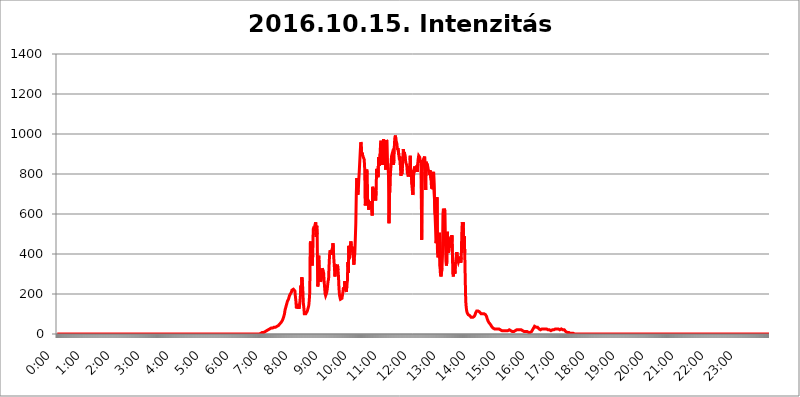
| Category | 2016.10.15. Intenzitás [W/m^2] |
|---|---|
| 0.0 | 0 |
| 0.0006944444444444445 | 0 |
| 0.001388888888888889 | 0 |
| 0.0020833333333333333 | 0 |
| 0.002777777777777778 | 0 |
| 0.003472222222222222 | 0 |
| 0.004166666666666667 | 0 |
| 0.004861111111111111 | 0 |
| 0.005555555555555556 | 0 |
| 0.0062499999999999995 | 0 |
| 0.006944444444444444 | 0 |
| 0.007638888888888889 | 0 |
| 0.008333333333333333 | 0 |
| 0.009027777777777779 | 0 |
| 0.009722222222222222 | 0 |
| 0.010416666666666666 | 0 |
| 0.011111111111111112 | 0 |
| 0.011805555555555555 | 0 |
| 0.012499999999999999 | 0 |
| 0.013194444444444444 | 0 |
| 0.013888888888888888 | 0 |
| 0.014583333333333332 | 0 |
| 0.015277777777777777 | 0 |
| 0.015972222222222224 | 0 |
| 0.016666666666666666 | 0 |
| 0.017361111111111112 | 0 |
| 0.018055555555555557 | 0 |
| 0.01875 | 0 |
| 0.019444444444444445 | 0 |
| 0.02013888888888889 | 0 |
| 0.020833333333333332 | 0 |
| 0.02152777777777778 | 0 |
| 0.022222222222222223 | 0 |
| 0.02291666666666667 | 0 |
| 0.02361111111111111 | 0 |
| 0.024305555555555556 | 0 |
| 0.024999999999999998 | 0 |
| 0.025694444444444447 | 0 |
| 0.02638888888888889 | 0 |
| 0.027083333333333334 | 0 |
| 0.027777777777777776 | 0 |
| 0.02847222222222222 | 0 |
| 0.029166666666666664 | 0 |
| 0.029861111111111113 | 0 |
| 0.030555555555555555 | 0 |
| 0.03125 | 0 |
| 0.03194444444444445 | 0 |
| 0.03263888888888889 | 0 |
| 0.03333333333333333 | 0 |
| 0.034027777777777775 | 0 |
| 0.034722222222222224 | 0 |
| 0.035416666666666666 | 0 |
| 0.036111111111111115 | 0 |
| 0.03680555555555556 | 0 |
| 0.0375 | 0 |
| 0.03819444444444444 | 0 |
| 0.03888888888888889 | 0 |
| 0.03958333333333333 | 0 |
| 0.04027777777777778 | 0 |
| 0.04097222222222222 | 0 |
| 0.041666666666666664 | 0 |
| 0.042361111111111106 | 0 |
| 0.04305555555555556 | 0 |
| 0.043750000000000004 | 0 |
| 0.044444444444444446 | 0 |
| 0.04513888888888889 | 0 |
| 0.04583333333333334 | 0 |
| 0.04652777777777778 | 0 |
| 0.04722222222222222 | 0 |
| 0.04791666666666666 | 0 |
| 0.04861111111111111 | 0 |
| 0.049305555555555554 | 0 |
| 0.049999999999999996 | 0 |
| 0.05069444444444445 | 0 |
| 0.051388888888888894 | 0 |
| 0.052083333333333336 | 0 |
| 0.05277777777777778 | 0 |
| 0.05347222222222222 | 0 |
| 0.05416666666666667 | 0 |
| 0.05486111111111111 | 0 |
| 0.05555555555555555 | 0 |
| 0.05625 | 0 |
| 0.05694444444444444 | 0 |
| 0.057638888888888885 | 0 |
| 0.05833333333333333 | 0 |
| 0.05902777777777778 | 0 |
| 0.059722222222222225 | 0 |
| 0.06041666666666667 | 0 |
| 0.061111111111111116 | 0 |
| 0.06180555555555556 | 0 |
| 0.0625 | 0 |
| 0.06319444444444444 | 0 |
| 0.06388888888888888 | 0 |
| 0.06458333333333334 | 0 |
| 0.06527777777777778 | 0 |
| 0.06597222222222222 | 0 |
| 0.06666666666666667 | 0 |
| 0.06736111111111111 | 0 |
| 0.06805555555555555 | 0 |
| 0.06874999999999999 | 0 |
| 0.06944444444444443 | 0 |
| 0.07013888888888889 | 0 |
| 0.07083333333333333 | 0 |
| 0.07152777777777779 | 0 |
| 0.07222222222222223 | 0 |
| 0.07291666666666667 | 0 |
| 0.07361111111111111 | 0 |
| 0.07430555555555556 | 0 |
| 0.075 | 0 |
| 0.07569444444444444 | 0 |
| 0.0763888888888889 | 0 |
| 0.07708333333333334 | 0 |
| 0.07777777777777778 | 0 |
| 0.07847222222222222 | 0 |
| 0.07916666666666666 | 0 |
| 0.0798611111111111 | 0 |
| 0.08055555555555556 | 0 |
| 0.08125 | 0 |
| 0.08194444444444444 | 0 |
| 0.08263888888888889 | 0 |
| 0.08333333333333333 | 0 |
| 0.08402777777777777 | 0 |
| 0.08472222222222221 | 0 |
| 0.08541666666666665 | 0 |
| 0.08611111111111112 | 0 |
| 0.08680555555555557 | 0 |
| 0.08750000000000001 | 0 |
| 0.08819444444444445 | 0 |
| 0.08888888888888889 | 0 |
| 0.08958333333333333 | 0 |
| 0.09027777777777778 | 0 |
| 0.09097222222222222 | 0 |
| 0.09166666666666667 | 0 |
| 0.09236111111111112 | 0 |
| 0.09305555555555556 | 0 |
| 0.09375 | 0 |
| 0.09444444444444444 | 0 |
| 0.09513888888888888 | 0 |
| 0.09583333333333333 | 0 |
| 0.09652777777777777 | 0 |
| 0.09722222222222222 | 0 |
| 0.09791666666666667 | 0 |
| 0.09861111111111111 | 0 |
| 0.09930555555555555 | 0 |
| 0.09999999999999999 | 0 |
| 0.10069444444444443 | 0 |
| 0.1013888888888889 | 0 |
| 0.10208333333333335 | 0 |
| 0.10277777777777779 | 0 |
| 0.10347222222222223 | 0 |
| 0.10416666666666667 | 0 |
| 0.10486111111111111 | 0 |
| 0.10555555555555556 | 0 |
| 0.10625 | 0 |
| 0.10694444444444444 | 0 |
| 0.1076388888888889 | 0 |
| 0.10833333333333334 | 0 |
| 0.10902777777777778 | 0 |
| 0.10972222222222222 | 0 |
| 0.1111111111111111 | 0 |
| 0.11180555555555556 | 0 |
| 0.11180555555555556 | 0 |
| 0.1125 | 0 |
| 0.11319444444444444 | 0 |
| 0.11388888888888889 | 0 |
| 0.11458333333333333 | 0 |
| 0.11527777777777777 | 0 |
| 0.11597222222222221 | 0 |
| 0.11666666666666665 | 0 |
| 0.1173611111111111 | 0 |
| 0.11805555555555557 | 0 |
| 0.11944444444444445 | 0 |
| 0.12013888888888889 | 0 |
| 0.12083333333333333 | 0 |
| 0.12152777777777778 | 0 |
| 0.12222222222222223 | 0 |
| 0.12291666666666667 | 0 |
| 0.12291666666666667 | 0 |
| 0.12361111111111112 | 0 |
| 0.12430555555555556 | 0 |
| 0.125 | 0 |
| 0.12569444444444444 | 0 |
| 0.12638888888888888 | 0 |
| 0.12708333333333333 | 0 |
| 0.16875 | 0 |
| 0.12847222222222224 | 0 |
| 0.12916666666666668 | 0 |
| 0.12986111111111112 | 0 |
| 0.13055555555555556 | 0 |
| 0.13125 | 0 |
| 0.13194444444444445 | 0 |
| 0.1326388888888889 | 0 |
| 0.13333333333333333 | 0 |
| 0.13402777777777777 | 0 |
| 0.13402777777777777 | 0 |
| 0.13472222222222222 | 0 |
| 0.13541666666666666 | 0 |
| 0.1361111111111111 | 0 |
| 0.13749999999999998 | 0 |
| 0.13819444444444443 | 0 |
| 0.1388888888888889 | 0 |
| 0.13958333333333334 | 0 |
| 0.14027777777777778 | 0 |
| 0.14097222222222222 | 0 |
| 0.14166666666666666 | 0 |
| 0.1423611111111111 | 0 |
| 0.14305555555555557 | 0 |
| 0.14375000000000002 | 0 |
| 0.14444444444444446 | 0 |
| 0.1451388888888889 | 0 |
| 0.1451388888888889 | 0 |
| 0.14652777777777778 | 0 |
| 0.14722222222222223 | 0 |
| 0.14791666666666667 | 0 |
| 0.1486111111111111 | 0 |
| 0.14930555555555555 | 0 |
| 0.15 | 0 |
| 0.15069444444444444 | 0 |
| 0.15138888888888888 | 0 |
| 0.15208333333333332 | 0 |
| 0.15277777777777776 | 0 |
| 0.15347222222222223 | 0 |
| 0.15416666666666667 | 0 |
| 0.15486111111111112 | 0 |
| 0.15555555555555556 | 0 |
| 0.15625 | 0 |
| 0.15694444444444444 | 0 |
| 0.15763888888888888 | 0 |
| 0.15833333333333333 | 0 |
| 0.15902777777777777 | 0 |
| 0.15972222222222224 | 0 |
| 0.16041666666666668 | 0 |
| 0.16111111111111112 | 0 |
| 0.16180555555555556 | 0 |
| 0.1625 | 0 |
| 0.16319444444444445 | 0 |
| 0.1638888888888889 | 0 |
| 0.16458333333333333 | 0 |
| 0.16527777777777777 | 0 |
| 0.16597222222222222 | 0 |
| 0.16666666666666666 | 0 |
| 0.1673611111111111 | 0 |
| 0.16805555555555554 | 0 |
| 0.16874999999999998 | 0 |
| 0.16944444444444443 | 0 |
| 0.17013888888888887 | 0 |
| 0.1708333333333333 | 0 |
| 0.17152777777777775 | 0 |
| 0.17222222222222225 | 0 |
| 0.1729166666666667 | 0 |
| 0.17361111111111113 | 0 |
| 0.17430555555555557 | 0 |
| 0.17500000000000002 | 0 |
| 0.17569444444444446 | 0 |
| 0.1763888888888889 | 0 |
| 0.17708333333333334 | 0 |
| 0.17777777777777778 | 0 |
| 0.17847222222222223 | 0 |
| 0.17916666666666667 | 0 |
| 0.1798611111111111 | 0 |
| 0.18055555555555555 | 0 |
| 0.18125 | 0 |
| 0.18194444444444444 | 0 |
| 0.1826388888888889 | 0 |
| 0.18333333333333335 | 0 |
| 0.1840277777777778 | 0 |
| 0.18472222222222223 | 0 |
| 0.18541666666666667 | 0 |
| 0.18611111111111112 | 0 |
| 0.18680555555555556 | 0 |
| 0.1875 | 0 |
| 0.18819444444444444 | 0 |
| 0.18888888888888888 | 0 |
| 0.18958333333333333 | 0 |
| 0.19027777777777777 | 0 |
| 0.1909722222222222 | 0 |
| 0.19166666666666665 | 0 |
| 0.19236111111111112 | 0 |
| 0.19305555555555554 | 0 |
| 0.19375 | 0 |
| 0.19444444444444445 | 0 |
| 0.1951388888888889 | 0 |
| 0.19583333333333333 | 0 |
| 0.19652777777777777 | 0 |
| 0.19722222222222222 | 0 |
| 0.19791666666666666 | 0 |
| 0.1986111111111111 | 0 |
| 0.19930555555555554 | 0 |
| 0.19999999999999998 | 0 |
| 0.20069444444444443 | 0 |
| 0.20138888888888887 | 0 |
| 0.2020833333333333 | 0 |
| 0.2027777777777778 | 0 |
| 0.2034722222222222 | 0 |
| 0.2041666666666667 | 0 |
| 0.20486111111111113 | 0 |
| 0.20555555555555557 | 0 |
| 0.20625000000000002 | 0 |
| 0.20694444444444446 | 0 |
| 0.2076388888888889 | 0 |
| 0.20833333333333334 | 0 |
| 0.20902777777777778 | 0 |
| 0.20972222222222223 | 0 |
| 0.21041666666666667 | 0 |
| 0.2111111111111111 | 0 |
| 0.21180555555555555 | 0 |
| 0.2125 | 0 |
| 0.21319444444444444 | 0 |
| 0.2138888888888889 | 0 |
| 0.21458333333333335 | 0 |
| 0.2152777777777778 | 0 |
| 0.21597222222222223 | 0 |
| 0.21666666666666667 | 0 |
| 0.21736111111111112 | 0 |
| 0.21805555555555556 | 0 |
| 0.21875 | 0 |
| 0.21944444444444444 | 0 |
| 0.22013888888888888 | 0 |
| 0.22083333333333333 | 0 |
| 0.22152777777777777 | 0 |
| 0.2222222222222222 | 0 |
| 0.22291666666666665 | 0 |
| 0.2236111111111111 | 0 |
| 0.22430555555555556 | 0 |
| 0.225 | 0 |
| 0.22569444444444445 | 0 |
| 0.2263888888888889 | 0 |
| 0.22708333333333333 | 0 |
| 0.22777777777777777 | 0 |
| 0.22847222222222222 | 0 |
| 0.22916666666666666 | 0 |
| 0.2298611111111111 | 0 |
| 0.23055555555555554 | 0 |
| 0.23124999999999998 | 0 |
| 0.23194444444444443 | 0 |
| 0.23263888888888887 | 0 |
| 0.2333333333333333 | 0 |
| 0.2340277777777778 | 0 |
| 0.2347222222222222 | 0 |
| 0.2354166666666667 | 0 |
| 0.23611111111111113 | 0 |
| 0.23680555555555557 | 0 |
| 0.23750000000000002 | 0 |
| 0.23819444444444446 | 0 |
| 0.2388888888888889 | 0 |
| 0.23958333333333334 | 0 |
| 0.24027777777777778 | 0 |
| 0.24097222222222223 | 0 |
| 0.24166666666666667 | 0 |
| 0.2423611111111111 | 0 |
| 0.24305555555555555 | 0 |
| 0.24375 | 0 |
| 0.24444444444444446 | 0 |
| 0.24513888888888888 | 0 |
| 0.24583333333333335 | 0 |
| 0.2465277777777778 | 0 |
| 0.24722222222222223 | 0 |
| 0.24791666666666667 | 0 |
| 0.24861111111111112 | 0 |
| 0.24930555555555556 | 0 |
| 0.25 | 0 |
| 0.25069444444444444 | 0 |
| 0.2513888888888889 | 0 |
| 0.2520833333333333 | 0 |
| 0.25277777777777777 | 0 |
| 0.2534722222222222 | 0 |
| 0.25416666666666665 | 0 |
| 0.2548611111111111 | 0 |
| 0.2555555555555556 | 0 |
| 0.25625000000000003 | 0 |
| 0.2569444444444445 | 0 |
| 0.2576388888888889 | 0 |
| 0.25833333333333336 | 0 |
| 0.2590277777777778 | 0 |
| 0.25972222222222224 | 0 |
| 0.2604166666666667 | 0 |
| 0.2611111111111111 | 0 |
| 0.26180555555555557 | 0 |
| 0.2625 | 0 |
| 0.26319444444444445 | 0 |
| 0.2638888888888889 | 0 |
| 0.26458333333333334 | 0 |
| 0.2652777777777778 | 0 |
| 0.2659722222222222 | 0 |
| 0.26666666666666666 | 0 |
| 0.2673611111111111 | 0 |
| 0.26805555555555555 | 0 |
| 0.26875 | 0 |
| 0.26944444444444443 | 0 |
| 0.2701388888888889 | 0 |
| 0.2708333333333333 | 0 |
| 0.27152777777777776 | 0 |
| 0.2722222222222222 | 0 |
| 0.27291666666666664 | 0 |
| 0.2736111111111111 | 0 |
| 0.2743055555555555 | 0 |
| 0.27499999999999997 | 0 |
| 0.27569444444444446 | 0 |
| 0.27638888888888885 | 0 |
| 0.27708333333333335 | 0 |
| 0.2777777777777778 | 0 |
| 0.27847222222222223 | 0 |
| 0.2791666666666667 | 0 |
| 0.2798611111111111 | 0 |
| 0.28055555555555556 | 0 |
| 0.28125 | 0 |
| 0.28194444444444444 | 0 |
| 0.2826388888888889 | 0 |
| 0.2833333333333333 | 0 |
| 0.28402777777777777 | 3.525 |
| 0.2847222222222222 | 3.525 |
| 0.28541666666666665 | 3.525 |
| 0.28611111111111115 | 3.525 |
| 0.28680555555555554 | 7.887 |
| 0.28750000000000003 | 7.887 |
| 0.2881944444444445 | 7.887 |
| 0.2888888888888889 | 7.887 |
| 0.28958333333333336 | 7.887 |
| 0.2902777777777778 | 7.887 |
| 0.29097222222222224 | 12.257 |
| 0.2916666666666667 | 12.257 |
| 0.2923611111111111 | 12.257 |
| 0.29305555555555557 | 12.257 |
| 0.29375 | 16.636 |
| 0.29444444444444445 | 16.636 |
| 0.2951388888888889 | 16.636 |
| 0.29583333333333334 | 21.024 |
| 0.2965277777777778 | 21.024 |
| 0.2972222222222222 | 21.024 |
| 0.29791666666666666 | 25.419 |
| 0.2986111111111111 | 25.419 |
| 0.29930555555555555 | 25.419 |
| 0.3 | 29.823 |
| 0.30069444444444443 | 29.823 |
| 0.3013888888888889 | 29.823 |
| 0.3020833333333333 | 29.823 |
| 0.30277777777777776 | 29.823 |
| 0.3034722222222222 | 29.823 |
| 0.30416666666666664 | 34.234 |
| 0.3048611111111111 | 34.234 |
| 0.3055555555555555 | 34.234 |
| 0.30624999999999997 | 34.234 |
| 0.3069444444444444 | 34.234 |
| 0.3076388888888889 | 38.653 |
| 0.30833333333333335 | 38.653 |
| 0.3090277777777778 | 38.653 |
| 0.30972222222222223 | 43.079 |
| 0.3104166666666667 | 43.079 |
| 0.3111111111111111 | 47.511 |
| 0.31180555555555556 | 47.511 |
| 0.3125 | 51.951 |
| 0.31319444444444444 | 51.951 |
| 0.3138888888888889 | 56.398 |
| 0.3145833333333333 | 60.85 |
| 0.31527777777777777 | 65.31 |
| 0.3159722222222222 | 69.775 |
| 0.31666666666666665 | 74.246 |
| 0.31736111111111115 | 83.205 |
| 0.31805555555555554 | 92.184 |
| 0.31875000000000003 | 101.184 |
| 0.3194444444444445 | 119.235 |
| 0.3201388888888889 | 128.284 |
| 0.32083333333333336 | 137.347 |
| 0.3215277777777778 | 146.423 |
| 0.32222222222222224 | 155.509 |
| 0.3229166666666667 | 164.605 |
| 0.3236111111111111 | 169.156 |
| 0.32430555555555557 | 173.709 |
| 0.325 | 182.82 |
| 0.32569444444444445 | 191.937 |
| 0.3263888888888889 | 196.497 |
| 0.32708333333333334 | 201.058 |
| 0.3277777777777778 | 205.62 |
| 0.3284722222222222 | 210.182 |
| 0.32916666666666666 | 219.309 |
| 0.3298611111111111 | 223.873 |
| 0.33055555555555555 | 223.873 |
| 0.33125 | 223.873 |
| 0.33194444444444443 | 223.873 |
| 0.3326388888888889 | 219.309 |
| 0.3333333333333333 | 214.746 |
| 0.3340277777777778 | 187.378 |
| 0.3347222222222222 | 164.605 |
| 0.3354166666666667 | 128.284 |
| 0.3361111111111111 | 137.347 |
| 0.3368055555555556 | 150.964 |
| 0.33749999999999997 | 132.814 |
| 0.33819444444444446 | 132.814 |
| 0.33888888888888885 | 137.347 |
| 0.33958333333333335 | 132.814 |
| 0.34027777777777773 | 128.284 |
| 0.34097222222222223 | 187.378 |
| 0.3416666666666666 | 242.127 |
| 0.3423611111111111 | 205.62 |
| 0.3430555555555555 | 283.156 |
| 0.34375 | 260.373 |
| 0.3444444444444445 | 219.309 |
| 0.3451388888888889 | 155.509 |
| 0.3458333333333334 | 132.814 |
| 0.34652777777777777 | 101.184 |
| 0.34722222222222227 | 101.184 |
| 0.34791666666666665 | 101.184 |
| 0.34861111111111115 | 101.184 |
| 0.34930555555555554 | 101.184 |
| 0.35000000000000003 | 105.69 |
| 0.3506944444444444 | 114.716 |
| 0.3513888888888889 | 123.758 |
| 0.3520833333333333 | 128.284 |
| 0.3527777777777778 | 141.884 |
| 0.3534722222222222 | 169.156 |
| 0.3541666666666667 | 210.182 |
| 0.3548611111111111 | 453.968 |
| 0.35555555555555557 | 462.786 |
| 0.35625 | 391.685 |
| 0.35694444444444445 | 360.221 |
| 0.3576388888888889 | 342.162 |
| 0.35833333333333334 | 396.164 |
| 0.3590277777777778 | 523.88 |
| 0.3597222222222222 | 523.88 |
| 0.36041666666666666 | 536.82 |
| 0.3611111111111111 | 515.223 |
| 0.36180555555555555 | 549.704 |
| 0.3625 | 558.261 |
| 0.36319444444444443 | 484.735 |
| 0.3638888888888889 | 541.121 |
| 0.3645833333333333 | 497.836 |
| 0.3652777777777778 | 237.564 |
| 0.3659722222222222 | 251.251 |
| 0.3666666666666667 | 391.685 |
| 0.3673611111111111 | 337.639 |
| 0.3680555555555556 | 324.052 |
| 0.36874999999999997 | 292.259 |
| 0.36944444444444446 | 260.373 |
| 0.37013888888888885 | 260.373 |
| 0.37083333333333335 | 287.709 |
| 0.37152777777777773 | 328.584 |
| 0.37222222222222223 | 333.113 |
| 0.3729166666666666 | 314.98 |
| 0.3736111111111111 | 305.898 |
| 0.3743055555555555 | 264.932 |
| 0.375 | 233 |
| 0.3756944444444445 | 201.058 |
| 0.3763888888888889 | 191.937 |
| 0.3770833333333334 | 196.497 |
| 0.37777777777777777 | 205.62 |
| 0.37847222222222227 | 219.309 |
| 0.37916666666666665 | 219.309 |
| 0.37986111111111115 | 264.932 |
| 0.38055555555555554 | 274.047 |
| 0.38125000000000003 | 342.162 |
| 0.3819444444444444 | 396.164 |
| 0.3826388888888889 | 418.492 |
| 0.3833333333333333 | 409.574 |
| 0.3840277777777778 | 396.164 |
| 0.3847222222222222 | 414.035 |
| 0.3854166666666667 | 422.943 |
| 0.3861111111111111 | 431.833 |
| 0.38680555555555557 | 453.968 |
| 0.3875 | 400.638 |
| 0.38819444444444445 | 396.164 |
| 0.3888888888888889 | 324.052 |
| 0.38958333333333334 | 287.709 |
| 0.3902777777777778 | 346.682 |
| 0.3909722222222222 | 346.682 |
| 0.39166666666666666 | 333.113 |
| 0.3923611111111111 | 328.584 |
| 0.39305555555555555 | 346.682 |
| 0.39375 | 319.517 |
| 0.39444444444444443 | 287.709 |
| 0.3951388888888889 | 228.436 |
| 0.3958333333333333 | 196.497 |
| 0.3965277777777778 | 182.82 |
| 0.3972222222222222 | 173.709 |
| 0.3979166666666667 | 173.709 |
| 0.3986111111111111 | 173.709 |
| 0.3993055555555556 | 178.264 |
| 0.39999999999999997 | 182.82 |
| 0.40069444444444446 | 210.182 |
| 0.40138888888888885 | 233 |
| 0.40208333333333335 | 233 |
| 0.40277777777777773 | 219.309 |
| 0.40347222222222223 | 264.932 |
| 0.4041666666666666 | 223.873 |
| 0.4048611111111111 | 219.309 |
| 0.4055555555555555 | 210.182 |
| 0.40625 | 251.251 |
| 0.4069444444444445 | 264.932 |
| 0.4076388888888889 | 360.221 |
| 0.4083333333333334 | 305.898 |
| 0.40902777777777777 | 440.702 |
| 0.40972222222222227 | 378.224 |
| 0.41041666666666665 | 414.035 |
| 0.41111111111111115 | 409.574 |
| 0.41180555555555554 | 462.786 |
| 0.41250000000000003 | 440.702 |
| 0.4131944444444444 | 409.574 |
| 0.4138888888888889 | 436.27 |
| 0.4145833333333333 | 440.702 |
| 0.4152777777777778 | 382.715 |
| 0.4159722222222222 | 346.682 |
| 0.4166666666666667 | 378.224 |
| 0.4173611111111111 | 405.108 |
| 0.41805555555555557 | 475.972 |
| 0.41875 | 553.986 |
| 0.41944444444444445 | 703.762 |
| 0.4201388888888889 | 779.42 |
| 0.42083333333333334 | 723.889 |
| 0.4215277777777778 | 695.666 |
| 0.4222222222222222 | 719.877 |
| 0.42291666666666666 | 771.559 |
| 0.4236111111111111 | 814.519 |
| 0.42430555555555555 | 818.392 |
| 0.425 | 913.766 |
| 0.42569444444444443 | 958.814 |
| 0.4263888888888889 | 951.327 |
| 0.4270833333333333 | 891.099 |
| 0.4277777777777778 | 906.223 |
| 0.4284722222222222 | 891.099 |
| 0.4291666666666667 | 887.309 |
| 0.4298611111111111 | 887.309 |
| 0.4305555555555556 | 872.114 |
| 0.43124999999999997 | 822.26 |
| 0.43194444444444446 | 642.4 |
| 0.43263888888888885 | 658.909 |
| 0.43333333333333335 | 763.674 |
| 0.43402777777777773 | 822.26 |
| 0.43472222222222223 | 798.974 |
| 0.4354166666666666 | 654.791 |
| 0.4361111111111111 | 671.22 |
| 0.4368055555555555 | 621.613 |
| 0.4375 | 621.613 |
| 0.4381944444444445 | 663.019 |
| 0.4388888888888889 | 658.909 |
| 0.4395833333333334 | 642.4 |
| 0.44027777777777777 | 638.256 |
| 0.44097222222222227 | 625.784 |
| 0.44166666666666665 | 592.233 |
| 0.44236111111111115 | 735.89 |
| 0.44305555555555554 | 715.858 |
| 0.44375000000000003 | 727.896 |
| 0.4444444444444444 | 691.608 |
| 0.4451388888888889 | 715.858 |
| 0.4458333333333333 | 699.717 |
| 0.4465277777777778 | 667.123 |
| 0.4472222222222222 | 715.858 |
| 0.4479166666666667 | 826.123 |
| 0.4486111111111111 | 822.26 |
| 0.44930555555555557 | 814.519 |
| 0.45 | 783.342 |
| 0.45069444444444445 | 883.516 |
| 0.4513888888888889 | 860.676 |
| 0.45208333333333334 | 841.526 |
| 0.4527777777777778 | 898.668 |
| 0.4534722222222222 | 951.327 |
| 0.45416666666666666 | 966.295 |
| 0.4548611111111111 | 921.298 |
| 0.45555555555555555 | 951.327 |
| 0.45625 | 845.365 |
| 0.45694444444444443 | 955.071 |
| 0.4576388888888889 | 973.772 |
| 0.4583333333333333 | 947.58 |
| 0.4590277777777778 | 894.885 |
| 0.4597222222222222 | 921.298 |
| 0.4604166666666667 | 822.26 |
| 0.4611111111111111 | 955.071 |
| 0.4618055555555556 | 970.034 |
| 0.46249999999999997 | 962.555 |
| 0.46319444444444446 | 856.855 |
| 0.46388888888888885 | 845.365 |
| 0.46458333333333335 | 791.169 |
| 0.46527777777777773 | 553.986 |
| 0.46597222222222223 | 703.762 |
| 0.4666666666666666 | 711.832 |
| 0.4673611111111111 | 806.757 |
| 0.4680555555555555 | 837.682 |
| 0.46875 | 887.309 |
| 0.4694444444444445 | 887.309 |
| 0.4701388888888889 | 906.223 |
| 0.4708333333333334 | 898.668 |
| 0.47152777777777777 | 845.365 |
| 0.47222222222222227 | 868.305 |
| 0.47291666666666665 | 951.327 |
| 0.47361111111111115 | 984.98 |
| 0.47430555555555554 | 992.448 |
| 0.47500000000000003 | 970.034 |
| 0.4756944444444444 | 966.295 |
| 0.4763888888888889 | 951.327 |
| 0.4770833333333333 | 921.298 |
| 0.4777777777777778 | 928.819 |
| 0.4784722222222222 | 925.06 |
| 0.4791666666666667 | 894.885 |
| 0.4798611111111111 | 872.114 |
| 0.48055555555555557 | 887.309 |
| 0.48125 | 845.365 |
| 0.48194444444444445 | 791.169 |
| 0.4826388888888889 | 806.757 |
| 0.48333333333333334 | 798.974 |
| 0.4840277777777778 | 826.123 |
| 0.4847222222222222 | 883.516 |
| 0.48541666666666666 | 925.06 |
| 0.4861111111111111 | 883.516 |
| 0.48680555555555555 | 909.996 |
| 0.4875 | 906.223 |
| 0.48819444444444443 | 875.918 |
| 0.4888888888888889 | 856.855 |
| 0.4895833333333333 | 853.029 |
| 0.4902777777777778 | 841.526 |
| 0.4909722222222222 | 806.757 |
| 0.4916666666666667 | 802.868 |
| 0.4923611111111111 | 787.258 |
| 0.4930555555555556 | 806.757 |
| 0.49374999999999997 | 806.757 |
| 0.49444444444444446 | 845.365 |
| 0.49513888888888885 | 891.099 |
| 0.49583333333333335 | 787.258 |
| 0.49652777777777773 | 818.392 |
| 0.49722222222222223 | 751.803 |
| 0.4979166666666666 | 747.834 |
| 0.4986111111111111 | 695.666 |
| 0.4993055555555555 | 707.8 |
| 0.5 | 818.392 |
| 0.5006944444444444 | 822.26 |
| 0.5013888888888889 | 837.682 |
| 0.5020833333333333 | 822.26 |
| 0.5027777777777778 | 822.26 |
| 0.5034722222222222 | 833.834 |
| 0.5041666666666667 | 841.526 |
| 0.5048611111111111 | 810.641 |
| 0.5055555555555555 | 849.199 |
| 0.50625 | 875.918 |
| 0.5069444444444444 | 891.099 |
| 0.5076388888888889 | 891.099 |
| 0.5083333333333333 | 883.516 |
| 0.5090277777777777 | 868.305 |
| 0.5097222222222222 | 856.855 |
| 0.5104166666666666 | 868.305 |
| 0.5111111111111112 | 471.582 |
| 0.5118055555555555 | 810.641 |
| 0.5125000000000001 | 853.029 |
| 0.5131944444444444 | 868.305 |
| 0.513888888888889 | 875.918 |
| 0.5145833333333333 | 879.719 |
| 0.5152777777777778 | 887.309 |
| 0.5159722222222222 | 887.309 |
| 0.5166666666666667 | 719.877 |
| 0.517361111111111 | 860.676 |
| 0.5180555555555556 | 860.676 |
| 0.5187499999999999 | 864.493 |
| 0.5194444444444445 | 841.526 |
| 0.5201388888888888 | 826.123 |
| 0.5208333333333334 | 826.123 |
| 0.5215277777777778 | 806.757 |
| 0.5222222222222223 | 795.074 |
| 0.5229166666666667 | 818.392 |
| 0.5236111111111111 | 822.26 |
| 0.5243055555555556 | 771.559 |
| 0.525 | 727.896 |
| 0.5256944444444445 | 783.342 |
| 0.5263888888888889 | 795.074 |
| 0.5270833333333333 | 723.889 |
| 0.5277777777777778 | 810.641 |
| 0.5284722222222222 | 814.519 |
| 0.5291666666666667 | 810.641 |
| 0.5298611111111111 | 596.45 |
| 0.5305555555555556 | 532.513 |
| 0.53125 | 453.968 |
| 0.5319444444444444 | 471.582 |
| 0.5326388888888889 | 683.473 |
| 0.5333333333333333 | 405.108 |
| 0.5340277777777778 | 382.715 |
| 0.5347222222222222 | 382.715 |
| 0.5354166666666667 | 405.108 |
| 0.5361111111111111 | 506.542 |
| 0.5368055555555555 | 337.639 |
| 0.5375 | 296.808 |
| 0.5381944444444444 | 287.709 |
| 0.5388888888888889 | 292.259 |
| 0.5395833333333333 | 328.584 |
| 0.5402777777777777 | 391.685 |
| 0.5409722222222222 | 600.661 |
| 0.5416666666666666 | 625.784 |
| 0.5423611111111112 | 440.702 |
| 0.5430555555555555 | 625.784 |
| 0.5437500000000001 | 613.252 |
| 0.5444444444444444 | 458.38 |
| 0.545138888888889 | 364.728 |
| 0.5458333333333333 | 342.162 |
| 0.5465277777777778 | 364.728 |
| 0.5472222222222222 | 510.885 |
| 0.5479166666666667 | 458.38 |
| 0.548611111111111 | 405.108 |
| 0.5493055555555556 | 431.833 |
| 0.5499999999999999 | 471.582 |
| 0.5506944444444445 | 471.582 |
| 0.5513888888888888 | 462.786 |
| 0.5520833333333334 | 462.786 |
| 0.5527777777777778 | 431.833 |
| 0.5534722222222223 | 493.475 |
| 0.5541666666666667 | 409.574 |
| 0.5548611111111111 | 301.354 |
| 0.5555555555555556 | 287.709 |
| 0.55625 | 324.052 |
| 0.5569444444444445 | 337.639 |
| 0.5576388888888889 | 301.354 |
| 0.5583333333333333 | 346.682 |
| 0.5590277777777778 | 369.23 |
| 0.5597222222222222 | 391.685 |
| 0.5604166666666667 | 409.574 |
| 0.5611111111111111 | 387.202 |
| 0.5618055555555556 | 369.23 |
| 0.5625 | 360.221 |
| 0.5631944444444444 | 369.23 |
| 0.5638888888888889 | 387.202 |
| 0.5645833333333333 | 373.729 |
| 0.5652777777777778 | 378.224 |
| 0.5659722222222222 | 355.712 |
| 0.5666666666666667 | 382.715 |
| 0.5673611111111111 | 497.836 |
| 0.5680555555555555 | 558.261 |
| 0.56875 | 545.416 |
| 0.5694444444444444 | 558.261 |
| 0.5701388888888889 | 431.833 |
| 0.5708333333333333 | 489.108 |
| 0.5715277777777777 | 405.108 |
| 0.5722222222222222 | 274.047 |
| 0.5729166666666666 | 164.605 |
| 0.5736111111111112 | 132.814 |
| 0.5743055555555555 | 114.716 |
| 0.5750000000000001 | 105.69 |
| 0.5756944444444444 | 101.184 |
| 0.576388888888889 | 96.682 |
| 0.5770833333333333 | 92.184 |
| 0.5777777777777778 | 92.184 |
| 0.5784722222222222 | 92.184 |
| 0.5791666666666667 | 87.692 |
| 0.579861111111111 | 87.692 |
| 0.5805555555555556 | 83.205 |
| 0.5812499999999999 | 83.205 |
| 0.5819444444444445 | 83.205 |
| 0.5826388888888888 | 83.205 |
| 0.5833333333333334 | 87.692 |
| 0.5840277777777778 | 87.692 |
| 0.5847222222222223 | 87.692 |
| 0.5854166666666667 | 92.184 |
| 0.5861111111111111 | 96.682 |
| 0.5868055555555556 | 105.69 |
| 0.5875 | 110.201 |
| 0.5881944444444445 | 114.716 |
| 0.5888888888888889 | 119.235 |
| 0.5895833333333333 | 114.716 |
| 0.5902777777777778 | 114.716 |
| 0.5909722222222222 | 114.716 |
| 0.5916666666666667 | 110.201 |
| 0.5923611111111111 | 110.201 |
| 0.5930555555555556 | 110.201 |
| 0.59375 | 105.69 |
| 0.5944444444444444 | 101.184 |
| 0.5951388888888889 | 101.184 |
| 0.5958333333333333 | 101.184 |
| 0.5965277777777778 | 101.184 |
| 0.5972222222222222 | 101.184 |
| 0.5979166666666667 | 101.184 |
| 0.5986111111111111 | 101.184 |
| 0.5993055555555555 | 101.184 |
| 0.6 | 101.184 |
| 0.6006944444444444 | 96.682 |
| 0.6013888888888889 | 92.184 |
| 0.6020833333333333 | 87.692 |
| 0.6027777777777777 | 78.722 |
| 0.6034722222222222 | 74.246 |
| 0.6041666666666666 | 65.31 |
| 0.6048611111111112 | 60.85 |
| 0.6055555555555555 | 56.398 |
| 0.6062500000000001 | 56.398 |
| 0.6069444444444444 | 51.951 |
| 0.607638888888889 | 47.511 |
| 0.6083333333333333 | 43.079 |
| 0.6090277777777778 | 38.653 |
| 0.6097222222222222 | 38.653 |
| 0.6104166666666667 | 34.234 |
| 0.611111111111111 | 29.823 |
| 0.6118055555555556 | 29.823 |
| 0.6124999999999999 | 25.419 |
| 0.6131944444444445 | 25.419 |
| 0.6138888888888888 | 25.419 |
| 0.6145833333333334 | 25.419 |
| 0.6152777777777778 | 25.419 |
| 0.6159722222222223 | 25.419 |
| 0.6166666666666667 | 25.419 |
| 0.6173611111111111 | 25.419 |
| 0.6180555555555556 | 25.419 |
| 0.61875 | 25.419 |
| 0.6194444444444445 | 25.419 |
| 0.6201388888888889 | 21.024 |
| 0.6208333333333333 | 21.024 |
| 0.6215277777777778 | 21.024 |
| 0.6222222222222222 | 21.024 |
| 0.6229166666666667 | 21.024 |
| 0.6236111111111111 | 16.636 |
| 0.6243055555555556 | 16.636 |
| 0.625 | 16.636 |
| 0.6256944444444444 | 16.636 |
| 0.6263888888888889 | 16.636 |
| 0.6270833333333333 | 16.636 |
| 0.6277777777777778 | 16.636 |
| 0.6284722222222222 | 16.636 |
| 0.6291666666666667 | 16.636 |
| 0.6298611111111111 | 16.636 |
| 0.6305555555555555 | 16.636 |
| 0.63125 | 16.636 |
| 0.6319444444444444 | 16.636 |
| 0.6326388888888889 | 16.636 |
| 0.6333333333333333 | 21.024 |
| 0.6340277777777777 | 21.024 |
| 0.6347222222222222 | 21.024 |
| 0.6354166666666666 | 21.024 |
| 0.6361111111111112 | 16.636 |
| 0.6368055555555555 | 16.636 |
| 0.6375000000000001 | 16.636 |
| 0.6381944444444444 | 12.257 |
| 0.638888888888889 | 12.257 |
| 0.6395833333333333 | 12.257 |
| 0.6402777777777778 | 12.257 |
| 0.6409722222222222 | 16.636 |
| 0.6416666666666667 | 16.636 |
| 0.642361111111111 | 16.636 |
| 0.6430555555555556 | 21.024 |
| 0.6437499999999999 | 21.024 |
| 0.6444444444444445 | 21.024 |
| 0.6451388888888888 | 21.024 |
| 0.6458333333333334 | 21.024 |
| 0.6465277777777778 | 21.024 |
| 0.6472222222222223 | 21.024 |
| 0.6479166666666667 | 21.024 |
| 0.6486111111111111 | 21.024 |
| 0.6493055555555556 | 21.024 |
| 0.65 | 21.024 |
| 0.6506944444444445 | 21.024 |
| 0.6513888888888889 | 16.636 |
| 0.6520833333333333 | 16.636 |
| 0.6527777777777778 | 16.636 |
| 0.6534722222222222 | 12.257 |
| 0.6541666666666667 | 12.257 |
| 0.6548611111111111 | 12.257 |
| 0.6555555555555556 | 12.257 |
| 0.65625 | 12.257 |
| 0.6569444444444444 | 12.257 |
| 0.6576388888888889 | 12.257 |
| 0.6583333333333333 | 12.257 |
| 0.6590277777777778 | 12.257 |
| 0.6597222222222222 | 12.257 |
| 0.6604166666666667 | 12.257 |
| 0.6611111111111111 | 7.887 |
| 0.6618055555555555 | 7.887 |
| 0.6625 | 7.887 |
| 0.6631944444444444 | 7.887 |
| 0.6638888888888889 | 7.887 |
| 0.6645833333333333 | 12.257 |
| 0.6652777777777777 | 12.257 |
| 0.6659722222222222 | 16.636 |
| 0.6666666666666666 | 21.024 |
| 0.6673611111111111 | 25.419 |
| 0.6680555555555556 | 29.823 |
| 0.6687500000000001 | 34.234 |
| 0.6694444444444444 | 38.653 |
| 0.6701388888888888 | 38.653 |
| 0.6708333333333334 | 34.234 |
| 0.6715277777777778 | 34.234 |
| 0.6722222222222222 | 34.234 |
| 0.6729166666666666 | 34.234 |
| 0.6736111111111112 | 34.234 |
| 0.6743055555555556 | 34.234 |
| 0.6749999999999999 | 29.823 |
| 0.6756944444444444 | 25.419 |
| 0.6763888888888889 | 25.419 |
| 0.6770833333333334 | 25.419 |
| 0.6777777777777777 | 21.024 |
| 0.6784722222222223 | 21.024 |
| 0.6791666666666667 | 25.419 |
| 0.6798611111111111 | 25.419 |
| 0.6805555555555555 | 21.024 |
| 0.68125 | 25.419 |
| 0.6819444444444445 | 25.419 |
| 0.6826388888888889 | 25.419 |
| 0.6833333333333332 | 25.419 |
| 0.6840277777777778 | 25.419 |
| 0.6847222222222222 | 25.419 |
| 0.6854166666666667 | 25.419 |
| 0.686111111111111 | 25.419 |
| 0.6868055555555556 | 25.419 |
| 0.6875 | 21.024 |
| 0.6881944444444444 | 21.024 |
| 0.688888888888889 | 21.024 |
| 0.6895833333333333 | 21.024 |
| 0.6902777777777778 | 21.024 |
| 0.6909722222222222 | 21.024 |
| 0.6916666666666668 | 16.636 |
| 0.6923611111111111 | 16.636 |
| 0.6930555555555555 | 16.636 |
| 0.69375 | 16.636 |
| 0.6944444444444445 | 21.024 |
| 0.6951388888888889 | 21.024 |
| 0.6958333333333333 | 21.024 |
| 0.6965277777777777 | 21.024 |
| 0.6972222222222223 | 21.024 |
| 0.6979166666666666 | 21.024 |
| 0.6986111111111111 | 25.419 |
| 0.6993055555555556 | 25.419 |
| 0.7000000000000001 | 25.419 |
| 0.7006944444444444 | 25.419 |
| 0.7013888888888888 | 25.419 |
| 0.7020833333333334 | 25.419 |
| 0.7027777777777778 | 25.419 |
| 0.7034722222222222 | 25.419 |
| 0.7041666666666666 | 25.419 |
| 0.7048611111111112 | 21.024 |
| 0.7055555555555556 | 25.419 |
| 0.7062499999999999 | 25.419 |
| 0.7069444444444444 | 25.419 |
| 0.7076388888888889 | 25.419 |
| 0.7083333333333334 | 25.419 |
| 0.7090277777777777 | 21.024 |
| 0.7097222222222223 | 21.024 |
| 0.7104166666666667 | 21.024 |
| 0.7111111111111111 | 21.024 |
| 0.7118055555555555 | 16.636 |
| 0.7125 | 16.636 |
| 0.7131944444444445 | 12.257 |
| 0.7138888888888889 | 12.257 |
| 0.7145833333333332 | 12.257 |
| 0.7152777777777778 | 7.887 |
| 0.7159722222222222 | 7.887 |
| 0.7166666666666667 | 7.887 |
| 0.717361111111111 | 7.887 |
| 0.7180555555555556 | 3.525 |
| 0.71875 | 3.525 |
| 0.7194444444444444 | 3.525 |
| 0.720138888888889 | 3.525 |
| 0.7208333333333333 | 3.525 |
| 0.7215277777777778 | 3.525 |
| 0.7222222222222222 | 3.525 |
| 0.7229166666666668 | 0 |
| 0.7236111111111111 | 3.525 |
| 0.7243055555555555 | 0 |
| 0.725 | 0 |
| 0.7256944444444445 | 0 |
| 0.7263888888888889 | 0 |
| 0.7270833333333333 | 0 |
| 0.7277777777777777 | 0 |
| 0.7284722222222223 | 0 |
| 0.7291666666666666 | 0 |
| 0.7298611111111111 | 0 |
| 0.7305555555555556 | 0 |
| 0.7312500000000001 | 0 |
| 0.7319444444444444 | 0 |
| 0.7326388888888888 | 0 |
| 0.7333333333333334 | 0 |
| 0.7340277777777778 | 0 |
| 0.7347222222222222 | 0 |
| 0.7354166666666666 | 0 |
| 0.7361111111111112 | 0 |
| 0.7368055555555556 | 0 |
| 0.7374999999999999 | 0 |
| 0.7381944444444444 | 0 |
| 0.7388888888888889 | 0 |
| 0.7395833333333334 | 0 |
| 0.7402777777777777 | 0 |
| 0.7409722222222223 | 0 |
| 0.7416666666666667 | 0 |
| 0.7423611111111111 | 0 |
| 0.7430555555555555 | 0 |
| 0.74375 | 0 |
| 0.7444444444444445 | 0 |
| 0.7451388888888889 | 0 |
| 0.7458333333333332 | 0 |
| 0.7465277777777778 | 0 |
| 0.7472222222222222 | 0 |
| 0.7479166666666667 | 0 |
| 0.748611111111111 | 0 |
| 0.7493055555555556 | 0 |
| 0.75 | 0 |
| 0.7506944444444444 | 0 |
| 0.751388888888889 | 0 |
| 0.7520833333333333 | 0 |
| 0.7527777777777778 | 0 |
| 0.7534722222222222 | 0 |
| 0.7541666666666668 | 0 |
| 0.7548611111111111 | 0 |
| 0.7555555555555555 | 0 |
| 0.75625 | 0 |
| 0.7569444444444445 | 0 |
| 0.7576388888888889 | 0 |
| 0.7583333333333333 | 0 |
| 0.7590277777777777 | 0 |
| 0.7597222222222223 | 0 |
| 0.7604166666666666 | 0 |
| 0.7611111111111111 | 0 |
| 0.7618055555555556 | 0 |
| 0.7625000000000001 | 0 |
| 0.7631944444444444 | 0 |
| 0.7638888888888888 | 0 |
| 0.7645833333333334 | 0 |
| 0.7652777777777778 | 0 |
| 0.7659722222222222 | 0 |
| 0.7666666666666666 | 0 |
| 0.7673611111111112 | 0 |
| 0.7680555555555556 | 0 |
| 0.7687499999999999 | 0 |
| 0.7694444444444444 | 0 |
| 0.7701388888888889 | 0 |
| 0.7708333333333334 | 0 |
| 0.7715277777777777 | 0 |
| 0.7722222222222223 | 0 |
| 0.7729166666666667 | 0 |
| 0.7736111111111111 | 0 |
| 0.7743055555555555 | 0 |
| 0.775 | 0 |
| 0.7756944444444445 | 0 |
| 0.7763888888888889 | 0 |
| 0.7770833333333332 | 0 |
| 0.7777777777777778 | 0 |
| 0.7784722222222222 | 0 |
| 0.7791666666666667 | 0 |
| 0.779861111111111 | 0 |
| 0.7805555555555556 | 0 |
| 0.78125 | 0 |
| 0.7819444444444444 | 0 |
| 0.782638888888889 | 0 |
| 0.7833333333333333 | 0 |
| 0.7840277777777778 | 0 |
| 0.7847222222222222 | 0 |
| 0.7854166666666668 | 0 |
| 0.7861111111111111 | 0 |
| 0.7868055555555555 | 0 |
| 0.7875 | 0 |
| 0.7881944444444445 | 0 |
| 0.7888888888888889 | 0 |
| 0.7895833333333333 | 0 |
| 0.7902777777777777 | 0 |
| 0.7909722222222223 | 0 |
| 0.7916666666666666 | 0 |
| 0.7923611111111111 | 0 |
| 0.7930555555555556 | 0 |
| 0.7937500000000001 | 0 |
| 0.7944444444444444 | 0 |
| 0.7951388888888888 | 0 |
| 0.7958333333333334 | 0 |
| 0.7965277777777778 | 0 |
| 0.7972222222222222 | 0 |
| 0.7979166666666666 | 0 |
| 0.7986111111111112 | 0 |
| 0.7993055555555556 | 0 |
| 0.7999999999999999 | 0 |
| 0.8006944444444444 | 0 |
| 0.8013888888888889 | 0 |
| 0.8020833333333334 | 0 |
| 0.8027777777777777 | 0 |
| 0.8034722222222223 | 0 |
| 0.8041666666666667 | 0 |
| 0.8048611111111111 | 0 |
| 0.8055555555555555 | 0 |
| 0.80625 | 0 |
| 0.8069444444444445 | 0 |
| 0.8076388888888889 | 0 |
| 0.8083333333333332 | 0 |
| 0.8090277777777778 | 0 |
| 0.8097222222222222 | 0 |
| 0.8104166666666667 | 0 |
| 0.811111111111111 | 0 |
| 0.8118055555555556 | 0 |
| 0.8125 | 0 |
| 0.8131944444444444 | 0 |
| 0.813888888888889 | 0 |
| 0.8145833333333333 | 0 |
| 0.8152777777777778 | 0 |
| 0.8159722222222222 | 0 |
| 0.8166666666666668 | 0 |
| 0.8173611111111111 | 0 |
| 0.8180555555555555 | 0 |
| 0.81875 | 0 |
| 0.8194444444444445 | 0 |
| 0.8201388888888889 | 0 |
| 0.8208333333333333 | 0 |
| 0.8215277777777777 | 0 |
| 0.8222222222222223 | 0 |
| 0.8229166666666666 | 0 |
| 0.8236111111111111 | 0 |
| 0.8243055555555556 | 0 |
| 0.8250000000000001 | 0 |
| 0.8256944444444444 | 0 |
| 0.8263888888888888 | 0 |
| 0.8270833333333334 | 0 |
| 0.8277777777777778 | 0 |
| 0.8284722222222222 | 0 |
| 0.8291666666666666 | 0 |
| 0.8298611111111112 | 0 |
| 0.8305555555555556 | 0 |
| 0.8312499999999999 | 0 |
| 0.8319444444444444 | 0 |
| 0.8326388888888889 | 0 |
| 0.8333333333333334 | 0 |
| 0.8340277777777777 | 0 |
| 0.8347222222222223 | 0 |
| 0.8354166666666667 | 0 |
| 0.8361111111111111 | 0 |
| 0.8368055555555555 | 0 |
| 0.8375 | 0 |
| 0.8381944444444445 | 0 |
| 0.8388888888888889 | 0 |
| 0.8395833333333332 | 0 |
| 0.8402777777777778 | 0 |
| 0.8409722222222222 | 0 |
| 0.8416666666666667 | 0 |
| 0.842361111111111 | 0 |
| 0.8430555555555556 | 0 |
| 0.84375 | 0 |
| 0.8444444444444444 | 0 |
| 0.845138888888889 | 0 |
| 0.8458333333333333 | 0 |
| 0.8465277777777778 | 0 |
| 0.8472222222222222 | 0 |
| 0.8479166666666668 | 0 |
| 0.8486111111111111 | 0 |
| 0.8493055555555555 | 0 |
| 0.85 | 0 |
| 0.8506944444444445 | 0 |
| 0.8513888888888889 | 0 |
| 0.8520833333333333 | 0 |
| 0.8527777777777777 | 0 |
| 0.8534722222222223 | 0 |
| 0.8541666666666666 | 0 |
| 0.8548611111111111 | 0 |
| 0.8555555555555556 | 0 |
| 0.8562500000000001 | 0 |
| 0.8569444444444444 | 0 |
| 0.8576388888888888 | 0 |
| 0.8583333333333334 | 0 |
| 0.8590277777777778 | 0 |
| 0.8597222222222222 | 0 |
| 0.8604166666666666 | 0 |
| 0.8611111111111112 | 0 |
| 0.8618055555555556 | 0 |
| 0.8624999999999999 | 0 |
| 0.8631944444444444 | 0 |
| 0.8638888888888889 | 0 |
| 0.8645833333333334 | 0 |
| 0.8652777777777777 | 0 |
| 0.8659722222222223 | 0 |
| 0.8666666666666667 | 0 |
| 0.8673611111111111 | 0 |
| 0.8680555555555555 | 0 |
| 0.86875 | 0 |
| 0.8694444444444445 | 0 |
| 0.8701388888888889 | 0 |
| 0.8708333333333332 | 0 |
| 0.8715277777777778 | 0 |
| 0.8722222222222222 | 0 |
| 0.8729166666666667 | 0 |
| 0.873611111111111 | 0 |
| 0.8743055555555556 | 0 |
| 0.875 | 0 |
| 0.8756944444444444 | 0 |
| 0.876388888888889 | 0 |
| 0.8770833333333333 | 0 |
| 0.8777777777777778 | 0 |
| 0.8784722222222222 | 0 |
| 0.8791666666666668 | 0 |
| 0.8798611111111111 | 0 |
| 0.8805555555555555 | 0 |
| 0.88125 | 0 |
| 0.8819444444444445 | 0 |
| 0.8826388888888889 | 0 |
| 0.8833333333333333 | 0 |
| 0.8840277777777777 | 0 |
| 0.8847222222222223 | 0 |
| 0.8854166666666666 | 0 |
| 0.8861111111111111 | 0 |
| 0.8868055555555556 | 0 |
| 0.8875000000000001 | 0 |
| 0.8881944444444444 | 0 |
| 0.8888888888888888 | 0 |
| 0.8895833333333334 | 0 |
| 0.8902777777777778 | 0 |
| 0.8909722222222222 | 0 |
| 0.8916666666666666 | 0 |
| 0.8923611111111112 | 0 |
| 0.8930555555555556 | 0 |
| 0.8937499999999999 | 0 |
| 0.8944444444444444 | 0 |
| 0.8951388888888889 | 0 |
| 0.8958333333333334 | 0 |
| 0.8965277777777777 | 0 |
| 0.8972222222222223 | 0 |
| 0.8979166666666667 | 0 |
| 0.8986111111111111 | 0 |
| 0.8993055555555555 | 0 |
| 0.9 | 0 |
| 0.9006944444444445 | 0 |
| 0.9013888888888889 | 0 |
| 0.9020833333333332 | 0 |
| 0.9027777777777778 | 0 |
| 0.9034722222222222 | 0 |
| 0.9041666666666667 | 0 |
| 0.904861111111111 | 0 |
| 0.9055555555555556 | 0 |
| 0.90625 | 0 |
| 0.9069444444444444 | 0 |
| 0.907638888888889 | 0 |
| 0.9083333333333333 | 0 |
| 0.9090277777777778 | 0 |
| 0.9097222222222222 | 0 |
| 0.9104166666666668 | 0 |
| 0.9111111111111111 | 0 |
| 0.9118055555555555 | 0 |
| 0.9125 | 0 |
| 0.9131944444444445 | 0 |
| 0.9138888888888889 | 0 |
| 0.9145833333333333 | 0 |
| 0.9152777777777777 | 0 |
| 0.9159722222222223 | 0 |
| 0.9166666666666666 | 0 |
| 0.9173611111111111 | 0 |
| 0.9180555555555556 | 0 |
| 0.9187500000000001 | 0 |
| 0.9194444444444444 | 0 |
| 0.9201388888888888 | 0 |
| 0.9208333333333334 | 0 |
| 0.9215277777777778 | 0 |
| 0.9222222222222222 | 0 |
| 0.9229166666666666 | 0 |
| 0.9236111111111112 | 0 |
| 0.9243055555555556 | 0 |
| 0.9249999999999999 | 0 |
| 0.9256944444444444 | 0 |
| 0.9263888888888889 | 0 |
| 0.9270833333333334 | 0 |
| 0.9277777777777777 | 0 |
| 0.9284722222222223 | 0 |
| 0.9291666666666667 | 0 |
| 0.9298611111111111 | 0 |
| 0.9305555555555555 | 0 |
| 0.93125 | 0 |
| 0.9319444444444445 | 0 |
| 0.9326388888888889 | 0 |
| 0.9333333333333332 | 0 |
| 0.9340277777777778 | 0 |
| 0.9347222222222222 | 0 |
| 0.9354166666666667 | 0 |
| 0.936111111111111 | 0 |
| 0.9368055555555556 | 0 |
| 0.9375 | 0 |
| 0.9381944444444444 | 0 |
| 0.938888888888889 | 0 |
| 0.9395833333333333 | 0 |
| 0.9402777777777778 | 0 |
| 0.9409722222222222 | 0 |
| 0.9416666666666668 | 0 |
| 0.9423611111111111 | 0 |
| 0.9430555555555555 | 0 |
| 0.94375 | 0 |
| 0.9444444444444445 | 0 |
| 0.9451388888888889 | 0 |
| 0.9458333333333333 | 0 |
| 0.9465277777777777 | 0 |
| 0.9472222222222223 | 0 |
| 0.9479166666666666 | 0 |
| 0.9486111111111111 | 0 |
| 0.9493055555555556 | 0 |
| 0.9500000000000001 | 0 |
| 0.9506944444444444 | 0 |
| 0.9513888888888888 | 0 |
| 0.9520833333333334 | 0 |
| 0.9527777777777778 | 0 |
| 0.9534722222222222 | 0 |
| 0.9541666666666666 | 0 |
| 0.9548611111111112 | 0 |
| 0.9555555555555556 | 0 |
| 0.9562499999999999 | 0 |
| 0.9569444444444444 | 0 |
| 0.9576388888888889 | 0 |
| 0.9583333333333334 | 0 |
| 0.9590277777777777 | 0 |
| 0.9597222222222223 | 0 |
| 0.9604166666666667 | 0 |
| 0.9611111111111111 | 0 |
| 0.9618055555555555 | 0 |
| 0.9625 | 0 |
| 0.9631944444444445 | 0 |
| 0.9638888888888889 | 0 |
| 0.9645833333333332 | 0 |
| 0.9652777777777778 | 0 |
| 0.9659722222222222 | 0 |
| 0.9666666666666667 | 0 |
| 0.967361111111111 | 0 |
| 0.9680555555555556 | 0 |
| 0.96875 | 0 |
| 0.9694444444444444 | 0 |
| 0.970138888888889 | 0 |
| 0.9708333333333333 | 0 |
| 0.9715277777777778 | 0 |
| 0.9722222222222222 | 0 |
| 0.9729166666666668 | 0 |
| 0.9736111111111111 | 0 |
| 0.9743055555555555 | 0 |
| 0.975 | 0 |
| 0.9756944444444445 | 0 |
| 0.9763888888888889 | 0 |
| 0.9770833333333333 | 0 |
| 0.9777777777777777 | 0 |
| 0.9784722222222223 | 0 |
| 0.9791666666666666 | 0 |
| 0.9798611111111111 | 0 |
| 0.9805555555555556 | 0 |
| 0.9812500000000001 | 0 |
| 0.9819444444444444 | 0 |
| 0.9826388888888888 | 0 |
| 0.9833333333333334 | 0 |
| 0.9840277777777778 | 0 |
| 0.9847222222222222 | 0 |
| 0.9854166666666666 | 0 |
| 0.9861111111111112 | 0 |
| 0.9868055555555556 | 0 |
| 0.9874999999999999 | 0 |
| 0.9881944444444444 | 0 |
| 0.9888888888888889 | 0 |
| 0.9895833333333334 | 0 |
| 0.9902777777777777 | 0 |
| 0.9909722222222223 | 0 |
| 0.9916666666666667 | 0 |
| 0.9923611111111111 | 0 |
| 0.9930555555555555 | 0 |
| 0.99375 | 0 |
| 0.9944444444444445 | 0 |
| 0.9951388888888889 | 0 |
| 0.9958333333333332 | 0 |
| 0.9965277777777778 | 0 |
| 0.9972222222222222 | 0 |
| 0.9979166666666667 | 0 |
| 0.998611111111111 | 0 |
| 0.9993055555555556 | 0 |